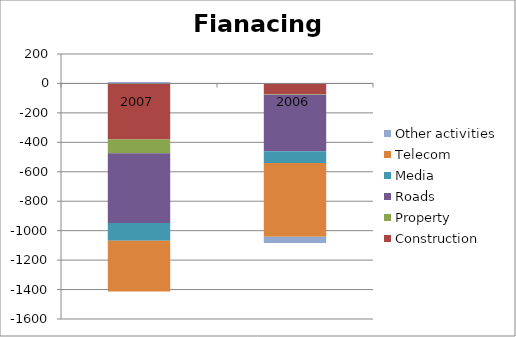
| Category | Construction | Property | Roads | Media | Telecom | Other activities |
|---|---|---|---|---|---|---|
| 2007.0 | -381 | -93 | -474 | -121 | -345 | 10 |
| 2006.0 | -73 | -4 | -384 | -79 | -502 | -41 |